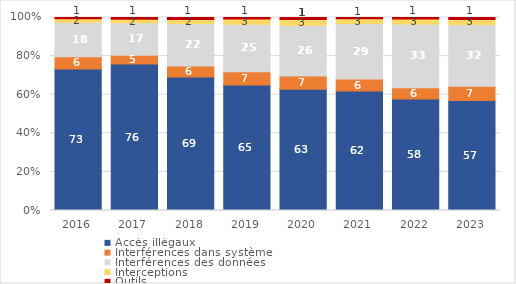
| Category | Accès illégaux  | Interférences dans système | Interférences des données | Interceptions | Outils |
|---|---|---|---|---|---|
| 2016.0 | 73.343 | 6.322 | 17.819 | 1.875 | 0.641 |
| 2017.0 | 75.852 | 4.632 | 16.76 | 1.847 | 0.909 |
| 2018.0 | 69.117 | 5.781 | 21.961 | 2.163 | 0.977 |
| 2019.0 | 65.087 | 6.813 | 24.643 | 2.62 | 0.837 |
| 2020.0 | 62.76 | 6.927 | 26.267 | 2.963 | 1.082 |
| 2021.0 | 61.927 | 6.188 | 28.749 | 2.548 | 0.588 |
| 2022.0 | 57.727 | 5.934 | 32.919 | 2.7 | 0.72 |
| 2023.0 | 56.934 | 7.435 | 32.053 | 2.605 | 0.973 |